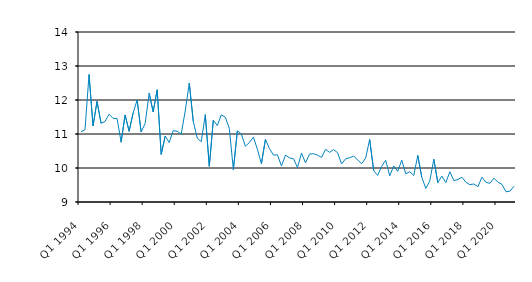
| Category | Series 0 |
|---|---|
| Q1 1994 | 11.067 |
| Q2 1994 | 11.129 |
| Q3 1994 | 12.75 |
| Q4 1994 | 11.238 |
| Q1 1995 | 11.961 |
| Q2 1995 | 11.316 |
| Q3 1995 | 11.37 |
| Q4 1995 | 11.583 |
| Q1 1996 | 11.46 |
| Q2 1996 | 11.458 |
| Q3 1996 | 10.759 |
| Q4 1996 | 11.56 |
| Q1 1997 | 11.08 |
| Q2 1997 | 11.616 |
| Q3 1997 | 12 |
| Q4 1997 | 11.059 |
| Q1 1998 | 11.312 |
| Q2 1998 | 12.199 |
| Q3 1998 | 11.649 |
| Q4 1998 | 12.3 |
| Q1 1999 | 10.4 |
| Q2 1999 | 10.939 |
| Q3 1999 | 10.75 |
| Q4 1999 | 11.1 |
| Q1 2000 | 11.08 |
| Q2 2000 | 11 |
| Q3 2000 | 11.679 |
| Q4 2000 | 12.5 |
| Q1 2001 | 11.375 |
| Q2 2001 | 10.875 |
| Q3 2001 | 10.775 |
| Q4 2001 | 11.57 |
| Q1 2002 | 10.05 |
| Q2 2002 | 11.405 |
| Q3 2002 | 11.25 |
| Q4 2002 | 11.566 |
| Q1 2003 | 11.492 |
| Q2 2003 | 11.162 |
| Q3 2003 | 9.95 |
| Q4 2003 | 11.091 |
| Q1 2004 | 11 |
| Q2 2004 | 10.638 |
| Q3 2004 | 10.75 |
| Q4 2004 | 10.908 |
| Q1 2005 | 10.55 |
| Q2 2005 | 10.125 |
| Q3 2005 | 10.843 |
| Q4 2005 | 10.573 |
| Q1 2006 | 10.38 |
| Q2 2006 | 10.387 |
| Q3 2006 | 10.06 |
| Q4 2006 | 10.38 |
| Q1 2007 | 10.3 |
| Q2 2007 | 10.27 |
| Q3 2007 | 10.017 |
| Q4 2007 | 10.44 |
| Q1 2008 | 10.15 |
| Q2 2008 | 10.41 |
| Q3 2008 | 10.42 |
| Q4 2008 | 10.38 |
| Q1 2009 | 10.31 |
| Q2 2009 | 10.55 |
| Q3 2009 | 10.46 |
| Q4 2009 | 10.54 |
| Q1 2010 | 10.45 |
| Q2 2010 | 10.12 |
| Q3 2010 | 10.27 |
| Q4 2010 | 10.3 |
| Q1 2011 | 10.35 |
| Q2 2011 | 10.24 |
| Q3 2011 | 10.125 |
| Q4 2011 | 10.29 |
| Q1 2012 | 10.84 |
| Q2 2012 | 9.92 |
| Q3 2012 | 9.78 |
| Q4 2012 | 10.05 |
| Q1 2013 | 10.23 |
| Q2 2013 | 9.77 |
| Q3 2013 | 10.06 |
| Q4 2013 | 9.9 |
| Q1 2014 | 10.23 |
| Q2 2014 | 9.83 |
| Q3 2014 | 9.89 |
| Q4 2014 | 9.78 |
| Q1 2015 | 10.37 |
| Q2 2015 | 9.726 |
| Q3 2015 | 9.4 |
| Q4 2015 | 9.62 |
| Q1 2016 | 10.26 |
| Q2 2016 | 9.57 |
| Q3 2016 | 9.76 |
| Q4 2016 | 9.57 |
| Q1 2017 | 9.89 |
| Q2 2017 | 9.63 |
| Q3 2017 | 9.66 |
| Q4 2017 | 9.73 |
| Q1 2018 | 9.58 |
| Q2 2018 | 9.51 |
| Q3 2018 | 9.53 |
| Q4 2018 | 9.45 |
| Q1 2019 | 9.73 |
| Q2 2019 | 9.58 |
| Q3 2019 | 9.55 |
| Q4 2019 | 9.7 |
| Q1 2020 | 9.58 |
| Q2 2020 | 9.52 |
| Q3 2020 | 9.3 |
| Q4 2020 | 9.32 |
| Q1 2021 | 9.464 |